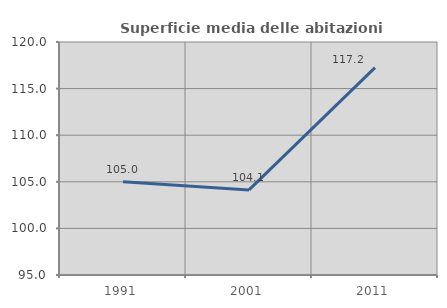
| Category | Superficie media delle abitazioni occupate |
|---|---|
| 1991.0 | 105.016 |
| 2001.0 | 104.132 |
| 2011.0 | 117.246 |